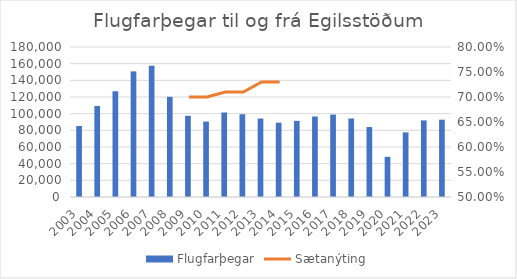
| Category | Flugfarþegar |
|---|---|
| 2003.0 | 85231 |
| 2004.0 | 109159 |
| 2005.0 | 126895 |
| 2006.0 | 150748 |
| 2007.0 | 157643 |
| 2008.0 | 120223 |
| 2009.0 | 97422 |
| 2010.0 | 90543 |
| 2011.0 | 101424 |
| 2012.0 | 99278 |
| 2013.0 | 94162 |
| 2014.0 | 89186 |
| 2015.0 | 91373 |
| 2016.0 | 96629 |
| 2017.0 | 98909 |
| 2018.0 | 94225 |
| 2019.0 | 83954 |
| 2020.0 | 48173 |
| 2021.0 | 77506 |
| 2022.0 | 91919 |
| 2023.0 | 92795 |